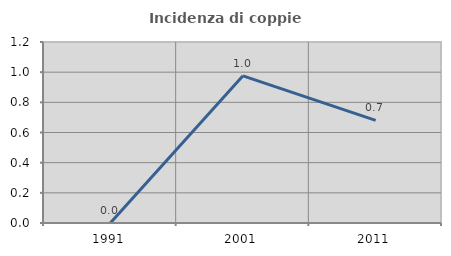
| Category | Incidenza di coppie miste |
|---|---|
| 1991.0 | 0 |
| 2001.0 | 0.976 |
| 2011.0 | 0.68 |